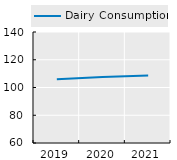
| Category | Dairy Consumption |
|---|---|
| 2019.0 | 105.922 |
| 2020.0 | 107.619 |
| 2021.0 | 108.57 |